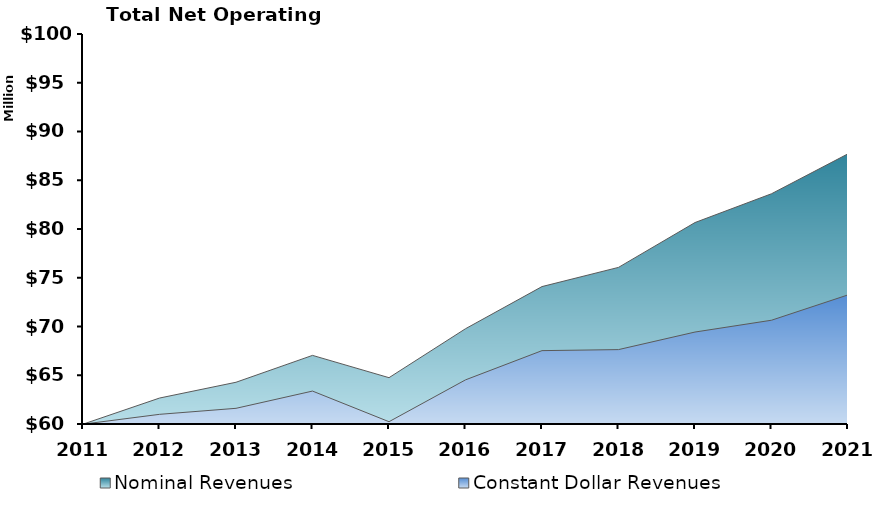
| Category | Nominal Revenues | Constant Dollar Revenues |
|---|---|---|
| 2011.0 | 59981702 | 59981702 |
| 2012.0 | 62660469 | 60990550.802 |
| 2013.0 | 64280962 | 61607995.07 |
| 2014.0 | 67036923 | 63376868.783 |
| 2015.0 | 64750588 | 60234285.232 |
| 2016.0 | 69771723 | 64525933.152 |
| 2017.0 | 74095958 | 67525452.703 |
| 2018.0 | 76063236 | 67630757.402 |
| 2019.0 | 80661919 | 69431252.975 |
| 2020.0 | 83616737 | 70642752.184 |
| 2021.0 | 87712017 | 73242465.128 |